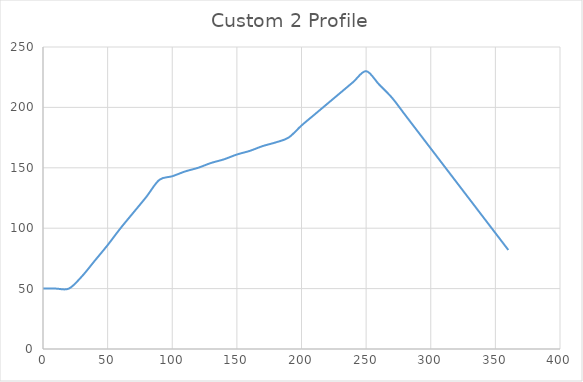
| Category | Custom 2 Profile |
|---|---|
| 0.0 | 50 |
| 10.0 | 50 |
| 20.0 | 50 |
| 30.0 | 60 |
| 40.0 | 73 |
| 50.0 | 86 |
| 60.0 | 100 |
| 70.0 | 113 |
| 80.0 | 126 |
| 90.0 | 140 |
| 100.0 | 143 |
| 110.0 | 147 |
| 120.0 | 150 |
| 130.0 | 154 |
| 140.0 | 157 |
| 150.0 | 161 |
| 160.0 | 164 |
| 170.0 | 168 |
| 180.0 | 171 |
| 190.0 | 175 |
| 200.0 | 185 |
| 210.0 | 194 |
| 220.0 | 203 |
| 230.0 | 212 |
| 240.0 | 221 |
| 250.0 | 230 |
| 260.0 | 219 |
| 270.0 | 208 |
| 280.0 | 194 |
| 290.0 | 180 |
| 300.0 | 166 |
| 310.0 | 152 |
| 320.0 | 138 |
| 330.0 | 124 |
| 340.0 | 110 |
| 350.0 | 96 |
| 360.0 | 82 |